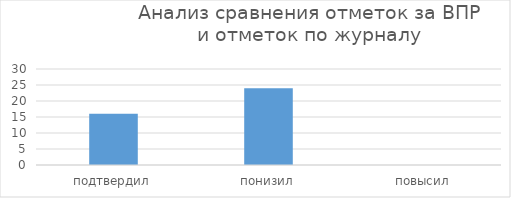
| Category | Series 0 |
|---|---|
| подтвердил | 16 |
| понизил | 24 |
| повысил | 0 |